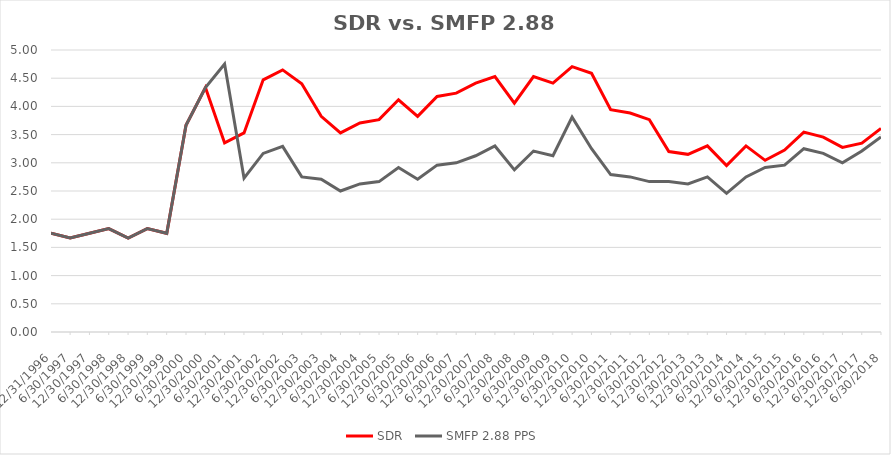
| Category | SDR | SMFP 2.88 PPS |
|---|---|---|
| 12/31/96 | 1.75 | 1.75 |
| 6/30/97 | 1.667 | 1.667 |
| 12/31/97 | 1.75 | 1.75 |
| 6/30/98 | 1.833 | 1.833 |
| 12/31/98 | 1.667 | 1.667 |
| 6/30/99 | 1.833 | 1.833 |
| 12/31/99 | 1.75 | 1.75 |
| 6/30/00 | 3.667 | 3.667 |
| 12/31/00 | 4.333 | 4.333 |
| 6/30/01 | 3.353 | 4.75 |
| 12/31/01 | 3.529 | 2.727 |
| 6/30/02 | 4.471 | 3.167 |
| 12/31/02 | 4.647 | 3.292 |
| 6/30/03 | 4.4 | 2.75 |
| 12/31/03 | 3.824 | 2.708 |
| 6/30/04 | 3.529 | 2.5 |
| 12/31/04 | 3.706 | 2.625 |
| 6/30/05 | 3.765 | 2.667 |
| 12/31/05 | 4.118 | 2.917 |
| 6/30/06 | 3.824 | 2.708 |
| 12/31/06 | 4.176 | 2.958 |
| 6/30/07 | 4.235 | 3 |
| 12/31/07 | 4.412 | 3.125 |
| 6/30/08 | 4.529 | 3.298 |
| 12/31/08 | 4.059 | 2.875 |
| 6/30/09 | 4.529 | 3.208 |
| 12/31/09 | 4.412 | 3.125 |
| 6/30/10 | 4.706 | 3.81 |
| 12/31/10 | 4.588 | 3.25 |
| 6/30/11 | 3.941 | 2.792 |
| 12/31/11 | 3.882 | 2.75 |
| 6/30/12 | 3.765 | 2.667 |
| 12/31/12 | 3.2 | 2.667 |
| 6/30/13 | 3.15 | 2.625 |
| 12/31/13 | 3.3 | 2.75 |
| 6/30/14 | 2.95 | 2.458 |
| 12/31/14 | 3.3 | 2.75 |
| 6/30/15 | 3.043 | 2.917 |
| 12/31/15 | 3.227 | 2.958 |
| 6/30/16 | 3.545 | 3.25 |
| 12/31/16 | 3.455 | 3.167 |
| 6/30/17 | 3.273 | 3 |
| 12/31/17 | 3.348 | 3.208 |
| 6/30/18 | 3.609 | 3.458 |